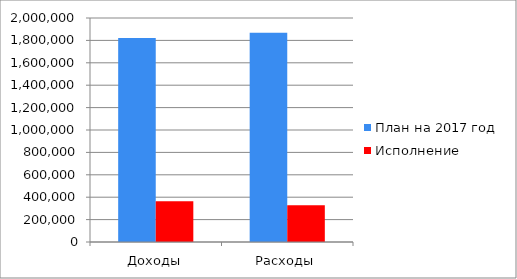
| Category | План на 2017 год | Исполнение |
|---|---|---|
| Доходы | 1820896 | 362794 |
| Расходы | 1867455 | 328248 |